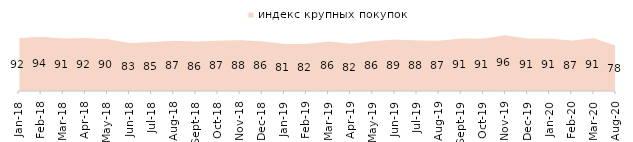
| Category | индекс крупных покупок |
|---|---|
| 2018-01-01 | 91.55 |
| 2018-02-01 | 93.75 |
| 2018-03-01 | 90.85 |
| 2018-04-01 | 91.5 |
| 2018-05-01 | 89.75 |
| 2018-06-01 | 82.95 |
| 2018-07-01 | 84.7 |
| 2018-08-01 | 87.05 |
| 2018-09-01 | 85.65 |
| 2018-10-01 | 87.15 |
| 2018-11-01 | 87.974 |
| 2018-12-01 | 85.95 |
| 2019-01-01 | 81.45 |
| 2019-02-01 | 81.55 |
| 2019-03-01 | 85.828 |
| 2019-04-01 | 81.98 |
| 2019-05-01 | 86.429 |
| 2019-06-01 | 89.027 |
| 2019-07-01 | 87.574 |
| 2019-08-01 | 87.213 |
| 2019-09-01 | 90.842 |
| 2019-10-01 | 90.644 |
| 2019-11-01 | 96.386 |
| 2019-12-01 | 90.644 |
| 2020-01-01 | 90.743 |
| 2020-02-01 | 87.228 |
| 2020-03-01 | 91.373 |
| 2020-08-01 | 78.252 |